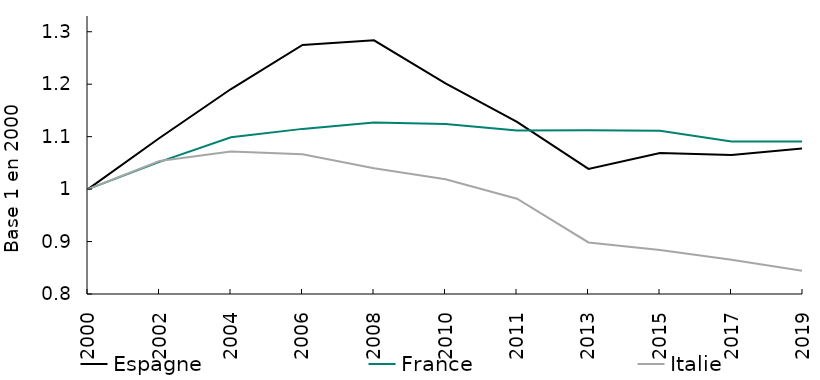
| Category | Espagne | France | Italie |
|---|---|---|---|
| 2000.0 | 1 | 1 | 1 |
| 2002.0 | 1.097 | 1.052 | 1.054 |
| 2004.0 | 1.191 | 1.099 | 1.072 |
| 2006.0 | 1.275 | 1.115 | 1.066 |
| 2008.0 | 1.284 | 1.127 | 1.04 |
| 2010.0 | 1.202 | 1.124 | 1.019 |
| 2011.0 | 1.128 | 1.112 | 0.982 |
| 2013.0 | 1.038 | 1.112 | 0.898 |
| 2015.0 | 1.069 | 1.111 | 0.884 |
| 2017.0 | 1.065 | 1.091 | 0.865 |
| 2019.0 | 1.077 | 1.091 | 0.844 |